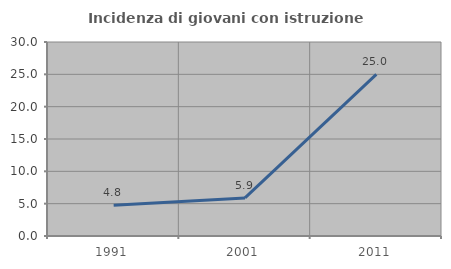
| Category | Incidenza di giovani con istruzione universitaria |
|---|---|
| 1991.0 | 4.762 |
| 2001.0 | 5.882 |
| 2011.0 | 25 |